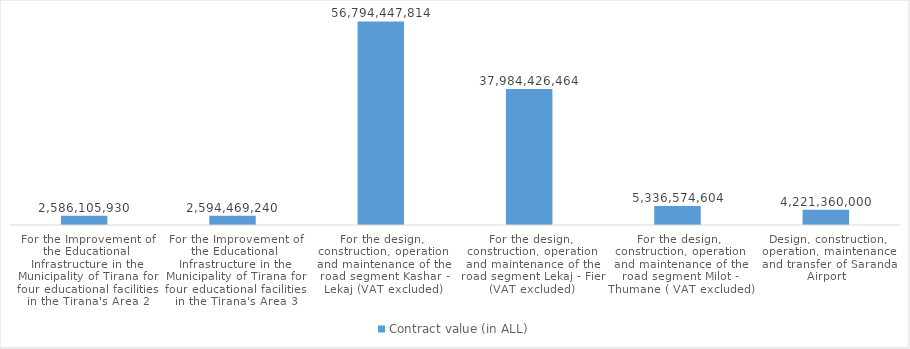
| Category | Contract value (in ALL) |
|---|---|
| For the Improvement of the Educational Infrastructure in the Municipality of Tirana for four educational facilities in the Tirana's Area 2 | 2586105930 |
| For the Improvement of the Educational Infrastructure in the Municipality of Tirana for four educational facilities in the Tirana's Area 3 | 2594469240 |
| For the design, construction, operation and maintenance of the road segment Kashar - Lekaj (VAT excluded) | 56794447814 |
| For the design, construction, operation and maintenance of the road segment Lekaj - Fier (VAT excluded) | 37984426464.4 |
| For the design, construction, operation and maintenance of the road segment Milot - Thumane ( VAT excluded) | 5336574604.4 |
| Design, construction, operation, maintenance and transfer of Saranda Airport | 4221360000 |